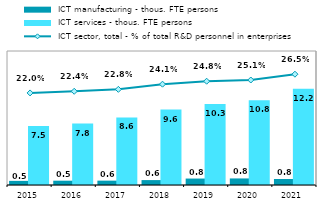
| Category |  ICT manufacturing - thous. FTE persons |  ICT services - thous. FTE persons |
|---|---|---|
| 2015.0 | 0.523 | 7.472 |
| 2016.0 | 0.546 | 7.793 |
| 2017.0 | 0.553 | 8.578 |
| 2018.0 | 0.623 | 9.573 |
| 2019.0 | 0.818 | 10.284 |
| 2020.0 | 0.832 | 10.76 |
| 2021.0 | 0.761 | 12.21 |